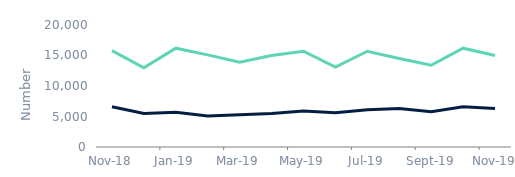
| Category | Remortgage | House purchase |
|---|---|---|
| 2018-11-01 | 6600 | 15800 |
| 2018-12-01 | 5500 | 13000 |
| 2019-01-01 | 5700 | 16200 |
| 2019-02-01 | 5100 | 15100 |
| 2019-03-01 | 5300 | 13900 |
| 2019-04-01 | 5500 | 15000 |
| 2019-05-01 | 5900 | 15700 |
| 2019-06-01 | 5600 | 13100 |
| 2019-07-01 | 6100 | 15700 |
| 2019-08-01 | 6300 | 14500 |
| 2019-09-01 | 5800 | 13400 |
| 2019-10-01 | 6600 | 16200 |
| 2019-11-01 | 6300 | 15000 |